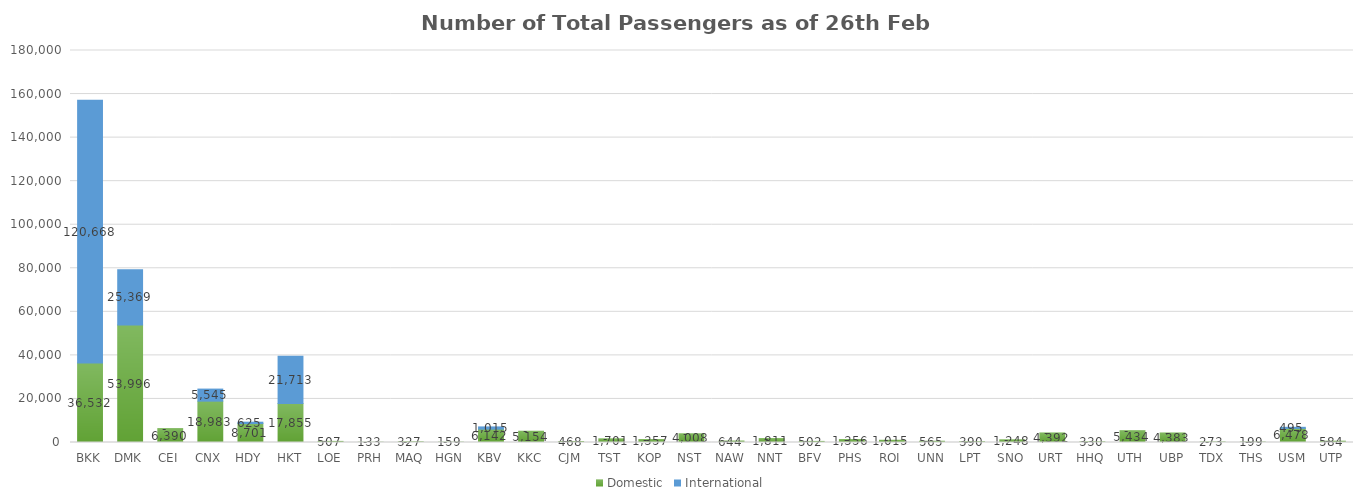
| Category | Domestic | International |
|---|---|---|
| BKK | 36532 | 120668 |
| DMK | 53996 | 25369 |
| CEI | 6390 | 0 |
| CNX | 18983 | 5545 |
| HDY | 8701 | 625 |
| HKT | 17855 | 21713 |
| LOE | 507 | 0 |
| PRH | 133 | 0 |
| MAQ | 327 | 0 |
| HGN | 159 | 0 |
| KBV | 6142 | 1015 |
| KKC | 5154 | 0 |
| CJM | 468 | 0 |
| TST | 1701 | 0 |
| KOP | 1357 | 0 |
| NST | 4008 | 0 |
| NAW | 644 | 0 |
| NNT | 1811 | 0 |
| BFV | 502 | 0 |
| PHS | 1356 | 0 |
| ROI | 1015 | 0 |
| UNN | 565 | 0 |
| LPT | 390 | 0 |
| SNO | 1248 | 0 |
| URT | 4392 | 0 |
| HHQ | 330 | 0 |
| UTH | 5434 | 0 |
| UBP | 4383 | 0 |
| TDX | 273 | 0 |
| THS | 199 | 0 |
| USM | 6478 | 495 |
| UTP | 584 | 0 |